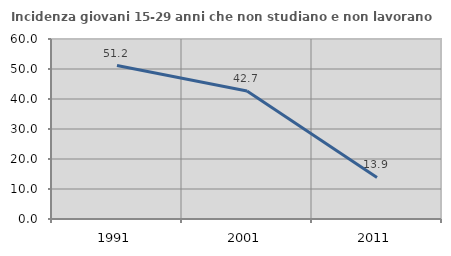
| Category | Incidenza giovani 15-29 anni che non studiano e non lavorano  |
|---|---|
| 1991.0 | 51.163 |
| 2001.0 | 42.697 |
| 2011.0 | 13.873 |